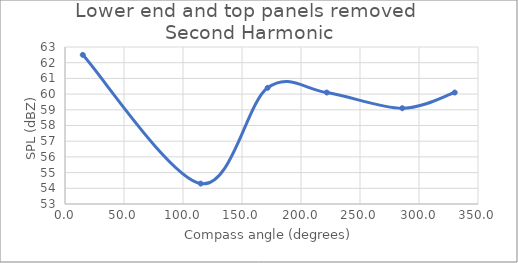
| Category | Series 0 |
|---|---|
| 15.06445125542554 | 62.5 |
| 115.00449447818254 | 54.3 |
| 171.7068171198818 | 60.4 |
| 221.8691292075067 | 60.1 |
| 285.7828166838848 | 59.1 |
| 330.28010595813004 | 60.1 |